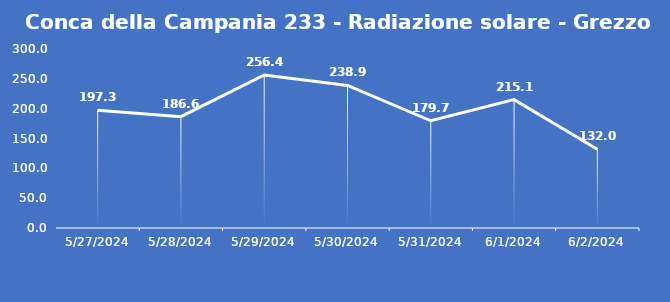
| Category | Conca della Campania 233 - Radiazione solare - Grezzo (W/m2) |
|---|---|
| 5/27/24 | 197.3 |
| 5/28/24 | 186.6 |
| 5/29/24 | 256.4 |
| 5/30/24 | 238.9 |
| 5/31/24 | 179.7 |
| 6/1/24 | 215.1 |
| 6/2/24 | 132 |